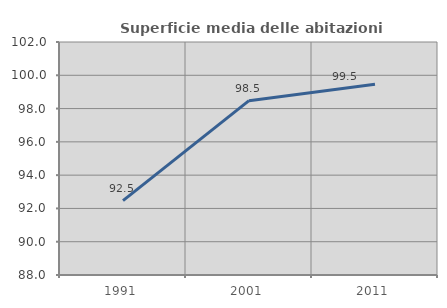
| Category | Superficie media delle abitazioni occupate |
|---|---|
| 1991.0 | 92.465 |
| 2001.0 | 98.475 |
| 2011.0 | 99.459 |